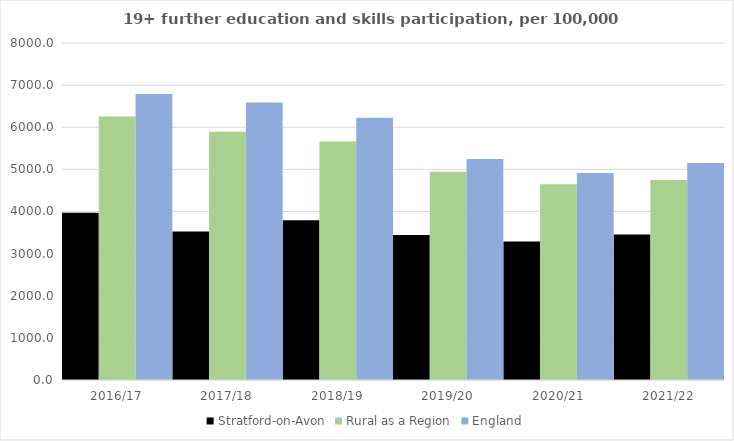
| Category | Stratford-on-Avon | Rural as a Region | England |
|---|---|---|---|
| 2016/17 | 3969 | 6253.401 | 6788 |
| 2017/18 | 3526 | 5892.029 | 6588 |
| 2018/19 | 3794 | 5661.873 | 6227 |
| 2019/20 | 3443 | 4943.801 | 5244 |
| 2020/21 | 3288 | 4646.727 | 4913 |
| 2021/22 | 3454 | 4747.049 | 5151 |